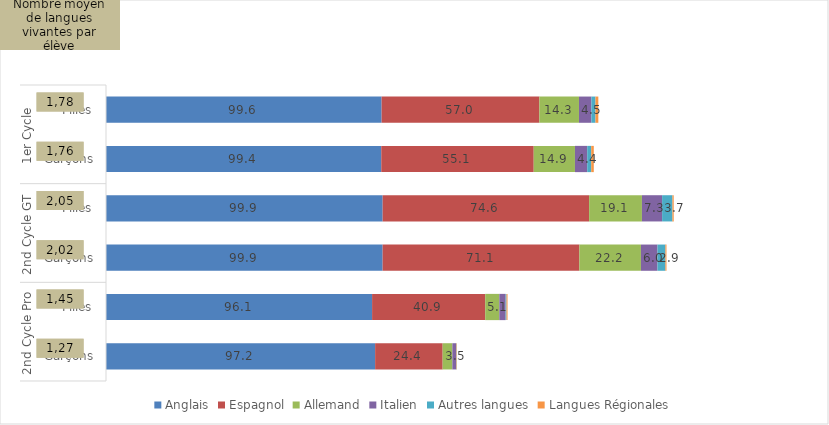
| Category | Anglais | Espagnol | Allemand | Italien | Autres langues | Langues Régionales |
|---|---|---|---|---|---|---|
| 0 | 99.567 | 56.997 | 14.312 | 4.479 | 1.478 | 1.032 |
| 1 | 99.445 | 55.08 | 14.9 | 4.425 | 1.445 | 0.929 |
| 2 | 99.948 | 74.597 | 19.071 | 7.287 | 3.73 | 0.468 |
| 3 | 99.94 | 71.076 | 22.243 | 5.974 | 2.862 | 0.391 |
| 4 | 96.131 | 40.872 | 5.094 | 2.272 | 0.331 | 0.364 |
| 5 | 97.228 | 24.398 | 3.508 | 1.323 | 0.146 | 0.162 |